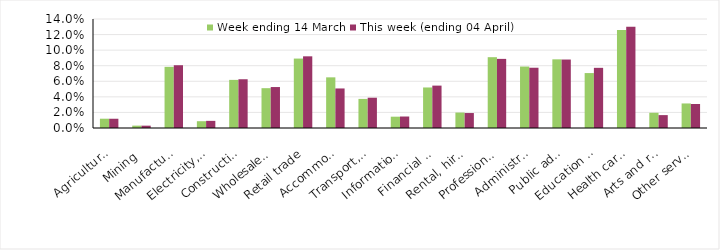
| Category | Week ending 14 March | This week (ending 04 April) |
|---|---|---|
| Agriculture, forestry and fishing | 0.012 | 0.012 |
| Mining | 0.003 | 0.003 |
| Manufacturing | 0.079 | 0.081 |
| Electricity, gas, water and waste services | 0.009 | 0.009 |
| Construction | 0.062 | 0.063 |
| Wholesale trade | 0.051 | 0.053 |
| Retail trade | 0.089 | 0.092 |
| Accommodation and food services | 0.065 | 0.051 |
| Transport, postal and warehousing | 0.037 | 0.039 |
| Information media and telecommunications | 0.015 | 0.015 |
| Financial and insurance services | 0.052 | 0.054 |
| Rental, hiring and real estate services | 0.02 | 0.019 |
| Professional, scientific and technical services | 0.091 | 0.089 |
| Administrative and support services | 0.079 | 0.077 |
| Public administration and safety | 0.088 | 0.088 |
| Education and training | 0.071 | 0.077 |
| Health care and social assistance | 0.126 | 0.13 |
| Arts and recreation services | 0.02 | 0.017 |
| Other services | 0.032 | 0.031 |